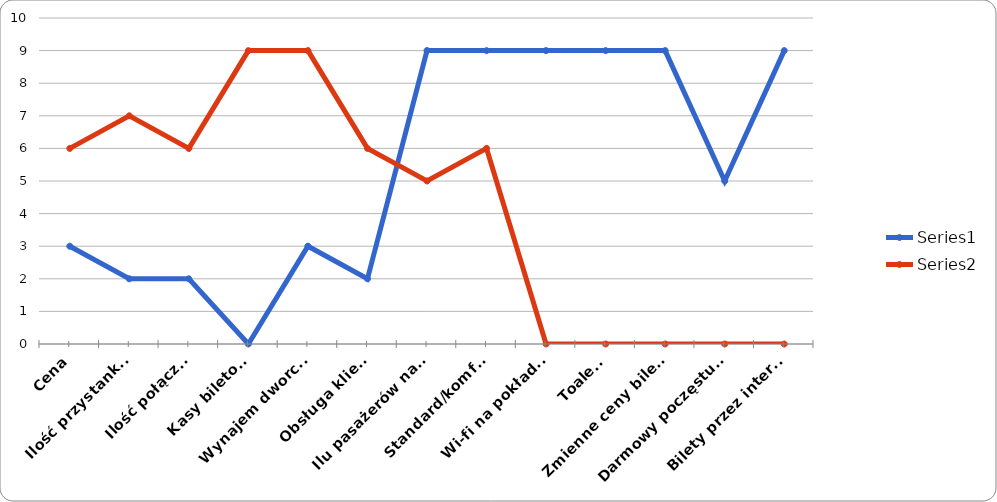
| Category | Series 0 | Series 1 |
|---|---|---|
| Cena | 3 | 6 |
| Ilość przystanków | 2 | 7 |
| Ilość połączeń | 2 | 6 |
| Kasy biletowe | 0 | 9 |
| Wynajem dworców | 3 | 9 |
| Obsługa klienta | 2 | 6 |
| Ilu pasażerów naraz | 9 | 5 |
| Standard/komfort | 9 | 6 |
| Wi-fi na pokładzie | 9 | 0 |
| Toaleta | 9 | 0 |
| Zmienne ceny biletów | 9 | 0 |
| Darmowy poczęstunek | 5 | 0 |
| Bilety przez internet | 9 | 0 |